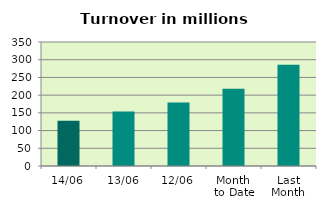
| Category | Series 0 |
|---|---|
| 14/06 | 127.43 |
| 13/06 | 154.081 |
| 12/06 | 179.321 |
| Month 
to Date | 218.326 |
| Last
Month | 285.992 |